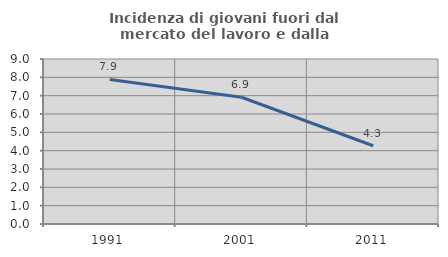
| Category | Incidenza di giovani fuori dal mercato del lavoro e dalla formazione  |
|---|---|
| 1991.0 | 7.885 |
| 2001.0 | 6.912 |
| 2011.0 | 4.268 |